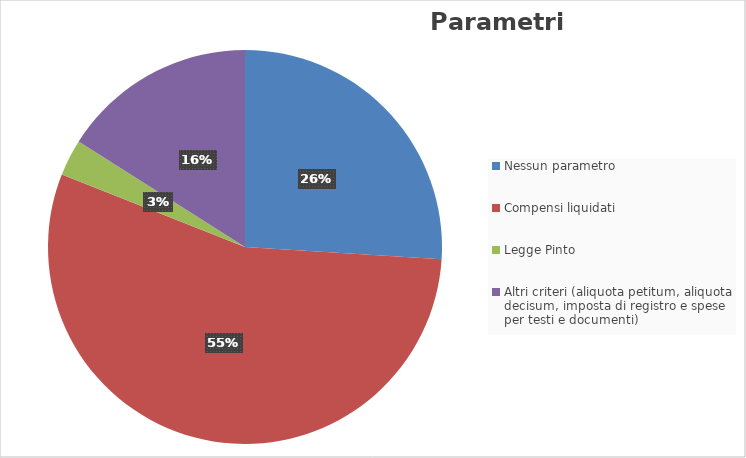
| Category | Series 0 |
|---|---|
| Nessun parametro | 0.26 |
| Compensi liquidati | 0.55 |
| Legge Pinto | 0.03 |
| Altri criteri (aliquota petitum, aliquota decisum, imposta di registro e spese per testi e documenti) | 0.16 |